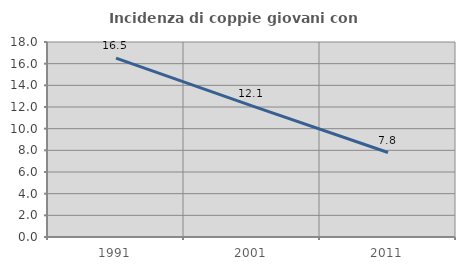
| Category | Incidenza di coppie giovani con figli |
|---|---|
| 1991.0 | 16.51 |
| 2001.0 | 12.109 |
| 2011.0 | 7.798 |